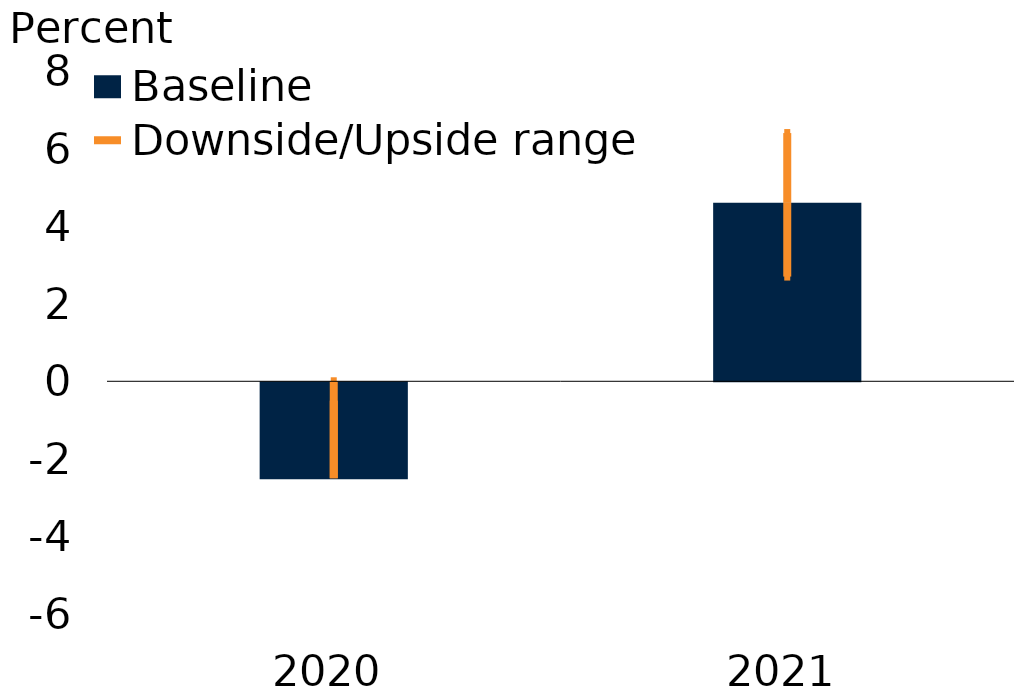
| Category | Baseline |
|---|---|
| 2020.0 | -2.5 |
| 2021.0 | 4.6 |